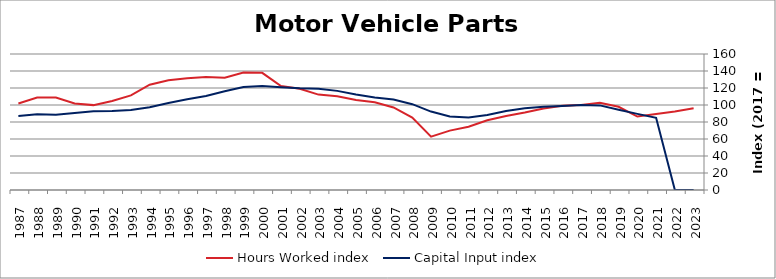
| Category | Hours Worked index | Capital Input index |
|---|---|---|
| 2023.0 | 96.28 | 0 |
| 2022.0 | 92.305 | 0 |
| 2021.0 | 89.399 | 84.894 |
| 2020.0 | 86.368 | 89.543 |
| 2019.0 | 97.891 | 94.441 |
| 2018.0 | 102.68 | 99.532 |
| 2017.0 | 100 | 100 |
| 2016.0 | 99.142 | 98.76 |
| 2015.0 | 95.917 | 98.007 |
| 2014.0 | 91.248 | 96.16 |
| 2013.0 | 87.113 | 93.049 |
| 2012.0 | 82.075 | 88.179 |
| 2011.0 | 74.391 | 85.28 |
| 2010.0 | 69.859 | 86.402 |
| 2009.0 | 62.714 | 92.273 |
| 2008.0 | 85.265 | 100.977 |
| 2007.0 | 97.102 | 106.518 |
| 2006.0 | 103.256 | 108.836 |
| 2005.0 | 105.961 | 112.256 |
| 2004.0 | 110.2 | 116.614 |
| 2003.0 | 112.217 | 119.082 |
| 2002.0 | 119.001 | 119.72 |
| 2001.0 | 122.341 | 120.867 |
| 2000.0 | 137.81 | 122.345 |
| 1999.0 | 138.256 | 121.065 |
| 1998.0 | 132.167 | 116.134 |
| 1997.0 | 133.004 | 110.569 |
| 1996.0 | 131.475 | 106.66 |
| 1995.0 | 129.135 | 102.336 |
| 1994.0 | 123.825 | 97.447 |
| 1993.0 | 111.279 | 94.102 |
| 1992.0 | 104.664 | 92.98 |
| 1991.0 | 99.858 | 92.51 |
| 1990.0 | 101.805 | 90.49 |
| 1989.0 | 108.788 | 88.48 |
| 1988.0 | 108.748 | 89.014 |
| 1987.0 | 101.801 | 87.149 |